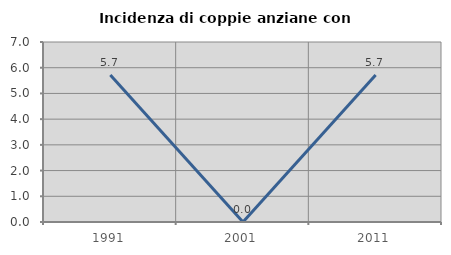
| Category | Incidenza di coppie anziane con figli |
|---|---|
| 1991.0 | 5.714 |
| 2001.0 | 0 |
| 2011.0 | 5.714 |